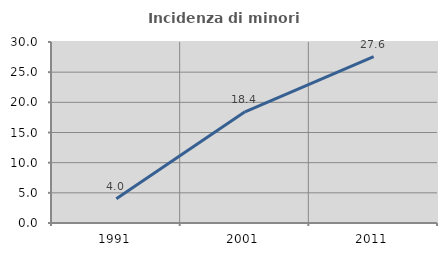
| Category | Incidenza di minori stranieri |
|---|---|
| 1991.0 | 4 |
| 2001.0 | 18.438 |
| 2011.0 | 27.58 |